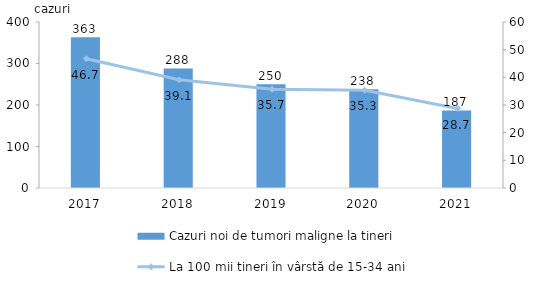
| Category | Cazuri noi de tumori maligne la tineri |
|---|---|
| 2017.0 | 363 |
| 2018.0 | 288 |
| 2019.0 | 250 |
| 2020.0 | 238 |
| 2021.0 | 187 |